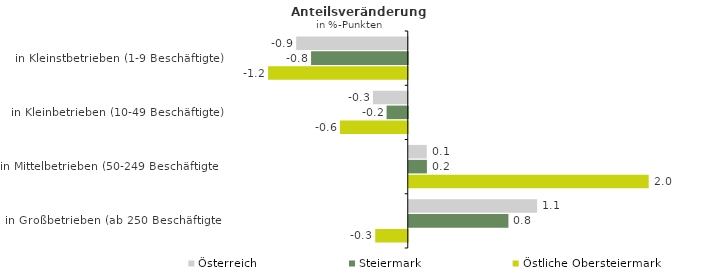
| Category | Österreich | Steiermark | Östliche Obersteiermark |
|---|---|---|---|
| in Kleinstbetrieben (1-9 Beschäftigte) | -0.926 | -0.802 | -1.159 |
| in Kleinbetrieben (10-49 Beschäftigte) | -0.289 | -0.176 | -0.563 |
| in Mittelbetrieben (50-249 Beschäftigte) | 0.149 | 0.151 | 1.991 |
| in Großbetrieben (ab 250 Beschäftigte) | 1.066 | 0.827 | -0.27 |